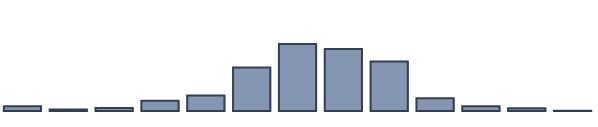
| Category | Series 0 |
|---|---|
| 0 | 1.669 |
| 1 | 0.509 |
| 2 | 1.117 |
| 3 | 3.722 |
| 4 | 5.568 |
| 5 | 15.651 |
| 6 | 24.138 |
| 7 | 22.355 |
| 8 | 17.865 |
| 9 | 4.629 |
| 10 | 1.724 |
| 11 | 1.001 |
| 12 | 0.052 |